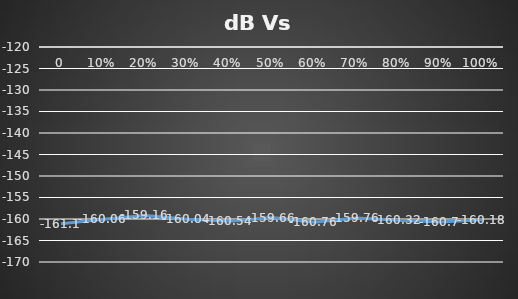
| Category | Series 0 |
|---|---|
| 0.0 | -161.1 |
| 0.1 | -160.06 |
| 0.2 | -159.16 |
| 0.3 | -160.04 |
| 0.4 | -160.54 |
| 0.5 | -159.66 |
| 0.6 | -160.76 |
| 0.7 | -159.76 |
| 0.8 | -160.32 |
| 0.9 | -160.7 |
| 1.0 | -160.18 |